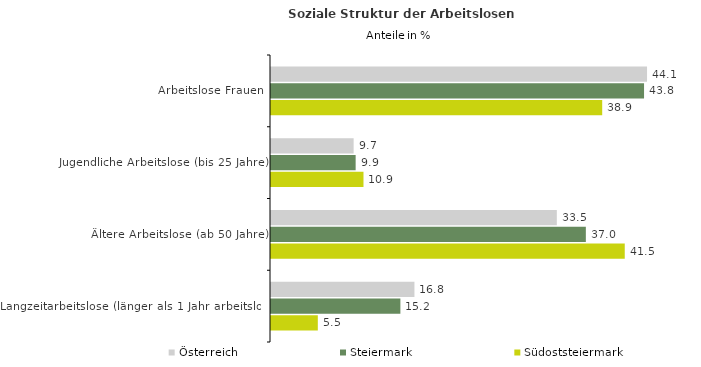
| Category | Österreich | Steiermark | Südoststeiermark |
|---|---|---|---|
| Arbeitslose Frauen | 44.136 | 43.785 | 38.874 |
| Jugendliche Arbeitslose (bis 25 Jahre) | 9.698 | 9.935 | 10.855 |
| Ältere Arbeitslose (ab 50 Jahre) | 33.548 | 36.954 | 41.52 |
| Langzeitarbeitslose (länger als 1 Jahr arbeitslos) | 16.836 | 15.186 | 5.495 |